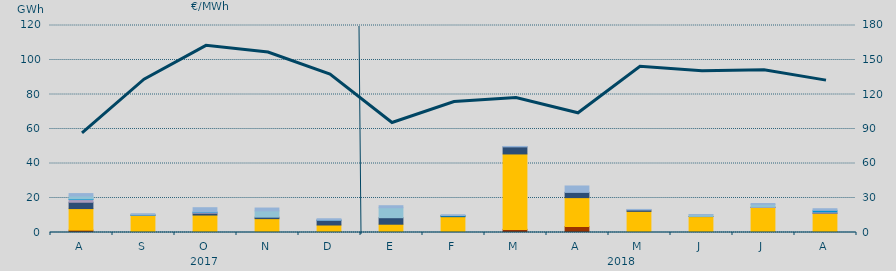
| Category | Carbón | Ciclo Combinado | Cogeneración | Consumo Bombeo | Enlace Península Baleares | Eólica | Hidráulica | Internacionales | Solar fotovoltaica | Turbinación bombeo |
|---|---|---|---|---|---|---|---|---|---|---|
| A | 1372.5 | 12488.5 | 0 | 3675.7 | 1561.2 | 0 | 359.5 | 1700.4 | 0 | 1397.9 |
| S | 0 | 9962.3 | 0 | 123.8 | 0 | 0 | 40 | 0 | 0 | 759.3 |
| O | 0 | 10119.2 | 0 | 1038.2 | 495.2 | 0 | 208.4 | 0 | 0 | 2510.5 |
| N | 0 | 8034.3 | 0 | 863.8 | 0 | 0 | 0 | 3635.7 | 0 | 1650.6 |
| D | 374 | 3967.2 | 0 | 2746.1 | 58.6 | 0 | 52.1 | 0 | 0 | 774.9 |
| E | 0 | 4799.8 | 0 | 3776.1 | 0 | 0 | 0 | 5766.5 | 0 | 1181.9 |
| F | 0 | 9167.2 | 0 | 319.8 | 0 | 0 | 367.5 | 0 | 0 | 436 |
| M | 1806.7 | 43724.8 | 0 | 4108.1 | 0 | 0 | 0 | 0 | 0 | 249 |
| A | 3485.4 | 16735.1 | 0 | 3030.8 | 0 | 0 | 0 | 0 | 0 | 3717.6 |
| M | 0 | 12256.8 | 0 | 795.1 | 0 | 0 | 0 | 0 | 0 | 330.9 |
| J | 0 | 9234.9 | 0 | 91.5 | 0 | 0 | 0 | 976 | 0 | 107.7 |
| J | 92.3 | 14456.3 | 0 | 14.6 | 244 | 0 | 0 | 1458.3 | 0 | 560.7 |
| A | 291.3 | 10832 | 0 | 140.5 | 678 | 0 | 898.1 | 0 | 0 | 948.3 |